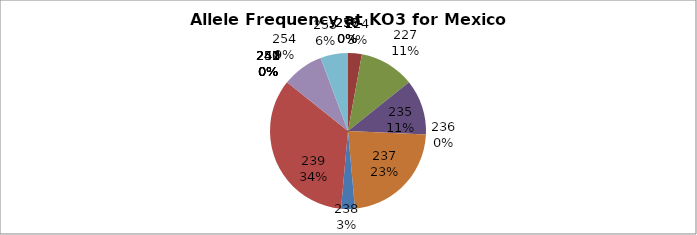
| Category | Series 0 |
|---|---|
| 218.0 | 0 |
| 224.0 | 0.029 |
| 227.0 | 0.114 |
| 235.0 | 0.114 |
| 236.0 | 0 |
| 237.0 | 0.229 |
| 238.0 | 0.029 |
| 239.0 | 0.343 |
| 240.0 | 0 |
| 241.0 | 0 |
| 247.0 | 0 |
| 249.0 | 0 |
| 250.0 | 0 |
| 251.0 | 0 |
| 252.0 | 0 |
| 254.0 | 0.086 |
| 255.0 | 0.057 |
| 256.0 | 0 |
| 257.0 | 0 |